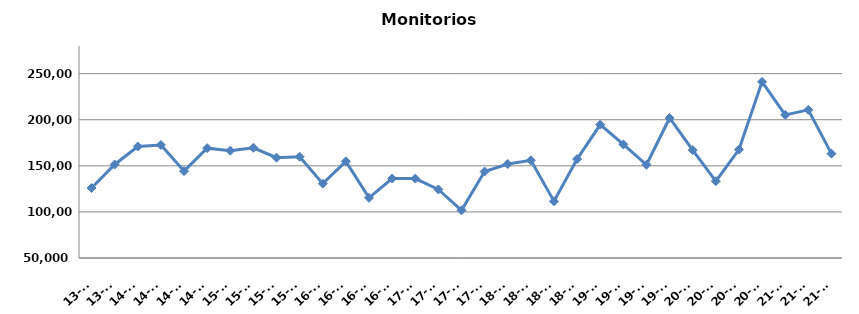
| Category | Monitorios ingresados |
|---|---|
| 13-T3 | 125943 |
| 13-T4 | 151448 |
| 14-T1 | 170973 |
| 14-T2 | 172648 |
| 14-T3 | 144262 |
| 14-T4 | 169174 |
| 15-T1 | 166433 |
| 15-T2 | 169612 |
| 15-T3 | 158859 |
| 15-T4 | 159890 |
| 16-T1 | 130680 |
| 16-T2 | 154860 |
| 16-T3 | 115269 |
| 16-T4 | 136245 |
| 17-T1 | 136155 |
| 17-T2 | 124382 |
| 17-T3 | 101751 |
| 17-T4 | 143788 |
| 18-T1 | 151974 |
| 18-T2 | 155991 |
| 18-T3 | 111544 |
| 18-T4 | 157337 |
| 19-T1 | 194715 |
| 19-T2 | 173225 |
| 19-T3 | 151156 |
| 19-T4 | 201895 |
| 20-T1 | 167095 |
| 20-T2 | 133351 |
| 20-T3 | 167630 |
| 20-T4 | 241119 |
| 21-T1 | 205212 |
| 21-T2 | 210707 |
| 21-T3 | 163259 |